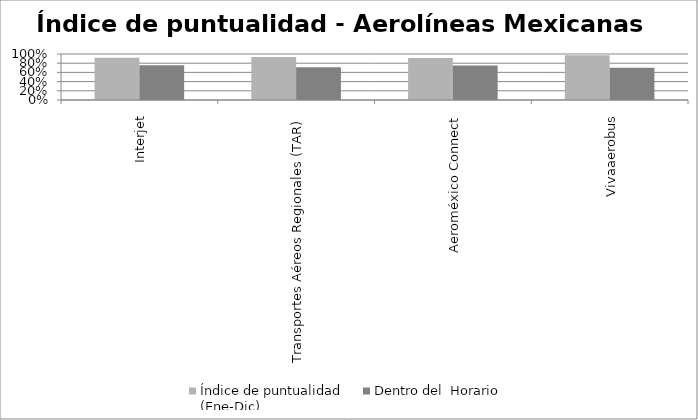
| Category | Índice de puntualidad
(Ene-Dic) | Dentro del  Horario |
|---|---|---|
| Interjet | 0.92 | 0.753 |
| Transportes Aéreos Regionales (TAR) | 0.937 | 0.711 |
| Aeroméxico Connect | 0.912 | 0.751 |
| Vivaaerobus | 0.971 | 0.704 |